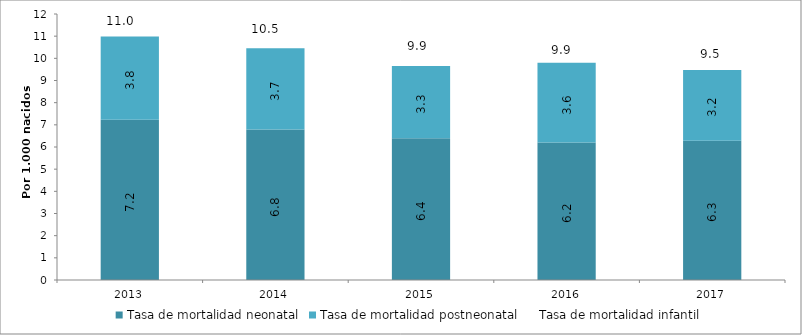
| Category | Tasa de mortalidad neonatal | Tasa de mortalidad postneonatal |
|---|---|---|
| 2013.0 | 7.229 | 3.755 |
| 2014.0 | 6.787 | 3.665 |
| 2015.0 | 6.4 | 3.256 |
| 2016.0 | 6.2 | 3.6 |
| 2017.0 | 6.282 | 3.191 |